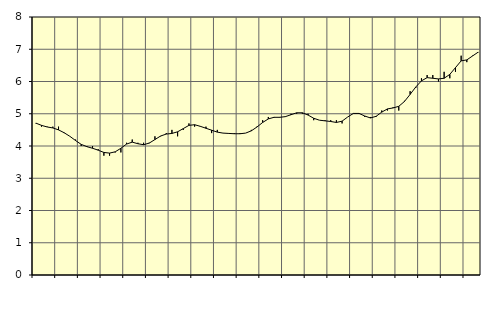
| Category | Piggar | Information och kommunikation, SNI 58-63 |
|---|---|---|
| nan | 4.7 | 4.71 |
| 1.0 | 4.6 | 4.64 |
| 1.0 | 4.6 | 4.59 |
| 1.0 | 4.6 | 4.56 |
| nan | 4.6 | 4.5 |
| 2.0 | 4.4 | 4.41 |
| 2.0 | 4.3 | 4.3 |
| 2.0 | 4.2 | 4.17 |
| nan | 4 | 4.05 |
| 3.0 | 4 | 3.98 |
| 3.0 | 4 | 3.93 |
| 3.0 | 3.9 | 3.87 |
| nan | 3.7 | 3.8 |
| 4.0 | 3.7 | 3.78 |
| 4.0 | 3.8 | 3.82 |
| 4.0 | 3.8 | 3.93 |
| nan | 4.1 | 4.06 |
| 5.0 | 4.2 | 4.12 |
| 5.0 | 4.1 | 4.07 |
| 5.0 | 4.1 | 4.04 |
| nan | 4.1 | 4.09 |
| 6.0 | 4.3 | 4.2 |
| 6.0 | 4.3 | 4.31 |
| 6.0 | 4.4 | 4.37 |
| nan | 4.5 | 4.39 |
| 7.0 | 4.3 | 4.44 |
| 7.0 | 4.5 | 4.54 |
| 7.0 | 4.7 | 4.64 |
| nan | 4.6 | 4.66 |
| 8.0 | 4.6 | 4.61 |
| 8.0 | 4.6 | 4.55 |
| 8.0 | 4.4 | 4.49 |
| nan | 4.5 | 4.43 |
| 9.0 | 4.4 | 4.4 |
| 9.0 | 4.4 | 4.39 |
| 9.0 | 4.4 | 4.38 |
| nan | 4.4 | 4.38 |
| 10.0 | 4.4 | 4.4 |
| 10.0 | 4.5 | 4.47 |
| 10.0 | 4.6 | 4.59 |
| nan | 4.8 | 4.73 |
| 11.0 | 4.9 | 4.84 |
| 11.0 | 4.9 | 4.89 |
| 11.0 | 4.9 | 4.89 |
| nan | 4.9 | 4.91 |
| 12.0 | 5 | 4.97 |
| 12.0 | 5 | 5.03 |
| 12.0 | 5 | 5.03 |
| nan | 5 | 4.96 |
| 13.0 | 4.8 | 4.86 |
| 13.0 | 4.8 | 4.8 |
| 13.0 | 4.8 | 4.78 |
| nan | 4.8 | 4.76 |
| 14.0 | 4.8 | 4.73 |
| 14.0 | 4.7 | 4.77 |
| 14.0 | 4.9 | 4.9 |
| nan | 5 | 5.01 |
| 15.0 | 5 | 5.01 |
| 15.0 | 4.9 | 4.93 |
| 15.0 | 4.9 | 4.87 |
| nan | 4.9 | 4.92 |
| 16.0 | 5.1 | 5.05 |
| 16.0 | 5.1 | 5.15 |
| 16.0 | 5.2 | 5.18 |
| nan | 5.1 | 5.23 |
| 17.0 | 5.4 | 5.38 |
| 17.0 | 5.7 | 5.6 |
| 17.0 | 5.8 | 5.83 |
| nan | 6.1 | 6.02 |
| 18.0 | 6.2 | 6.12 |
| 18.0 | 6.2 | 6.1 |
| 18.0 | 6 | 6.08 |
| nan | 6.3 | 6.1 |
| 19.0 | 6.1 | 6.22 |
| 19.0 | 6.3 | 6.43 |
| 19.0 | 6.8 | 6.64 |
| nan | 6.6 | 6.67 |
| 20.0 | 6.8 | 6.79 |
| 20.0 | 6.9 | 6.91 |